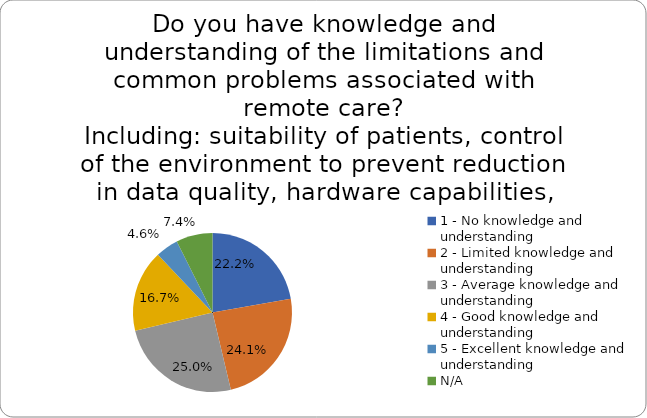
| Category | Series 0 |
|---|---|
| 1 - No knowledge and understanding | 0.222 |
| 2 - Limited knowledge and understanding | 0.241 |
| 3 - Average knowledge and understanding | 0.25 |
| 4 - Good knowledge and understanding | 0.167 |
| 5 - Excellent knowledge and understanding | 0.046 |
| N/A | 0.074 |